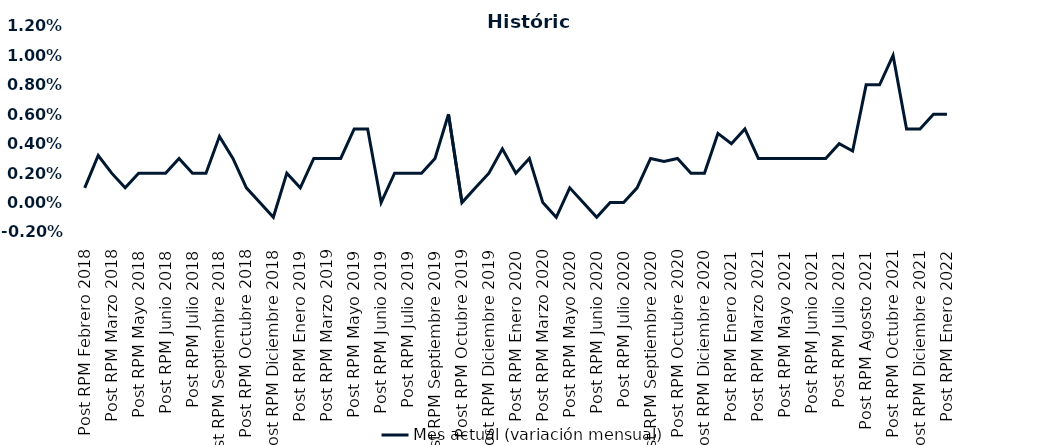
| Category | Mes actual (variación mensual)  |
|---|---|
| Post RPM Febrero 2018 | 0.001 |
| Pre RPM Marzo 2018 | 0.003 |
| Post RPM Marzo 2018 | 0.002 |
| Pre RPM Mayo 2018 | 0.001 |
| Post RPM Mayo 2018 | 0.002 |
| Pre RPM Junio 2018 | 0.002 |
| Post RPM Junio 2018 | 0.002 |
| Pre RPM Julio 2018 | 0.003 |
| Post RPM Julio 2018 | 0.002 |
| Pre RPM Septiembre 2018 | 0.002 |
| Post RPM Septiembre 2018 | 0.004 |
| Pre RPM Octubre 2018 | 0.003 |
| Post RPM Octubre 2018 | 0.001 |
| Pre RPM Diciembre 2018 | 0 |
| Post RPM Diciembre 2018 | -0.001 |
| Pre RPM Enero 2019 | 0.002 |
| Post RPM Enero 2019 | 0.001 |
| Pre RPM Marzo 2019 | 0.003 |
| Post RPM Marzo 2019 | 0.003 |
| Pre RPM Mayo 2019 | 0.003 |
| Post RPM Mayo 2019 | 0.005 |
| Pre RPM Junio 2019 | 0.005 |
| Post RPM Junio 2019 | 0 |
| Pre RPM Julio 2019 | 0.002 |
| Post RPM Julio 2019 | 0.002 |
| Pre RPM Septiembre 2019 | 0.002 |
| Post RPM Septiembre 2019 | 0.003 |
| Pre RPM Octubre 2019 | 0.006 |
| Post RPM Octubre 2019 | 0 |
| Pre RPM Diciembre 2019 | 0.001 |
| Post RPM Diciembre 2019 | 0.002 |
| Pre RPM Enero 2020 | 0.004 |
| Post RPM Enero 2020 | 0.002 |
| Pre RPM Marzo 2020 | 0.003 |
| Post RPM Marzo 2020 | 0 |
| Pre RPM Mayo 2020 | -0.001 |
| Post RPM Mayo 2020 | 0.001 |
| Pre RPM Junio 2020 | 0 |
| Post RPM Junio 2020 | -0.001 |
| Pre RPM Julio 2020 | 0 |
| Post RPM Julio 2020 | 0 |
| Pre RPM Septiembre 2020 | 0.001 |
| Post RPM Septiembre 2020 | 0.003 |
| Pre RPM Octubre 2020 | 0.003 |
| Post RPM Octubre 2020 | 0.003 |
| Pre RPM Diciembre 2020 | 0.002 |
| Post RPM Diciembre 2020 | 0.002 |
| Pre RPM Enero 2021 | 0.005 |
| Post RPM Enero 2021 | 0.004 |
| Pre RPM Marzo 2021 | 0.005 |
| Post RPM Marzo 2021 | 0.003 |
| Pre RPM Mayo 2021 | 0.003 |
| Post RPM Mayo 2021 | 0.003 |
| Pre RPM Junio 2021 | 0.003 |
| Post RPM Junio 2021 | 0.003 |
| Pre RPM Julio 2021 | 0.003 |
| Post RPM Julio 2021 | 0.004 |
| Pre RPM Agosto 2021 | 0.004 |
| Post RPM Agosto 2021 | 0.008 |
| Pre RPM Octubre 2021 | 0.008 |
| Post RPM Octubre 2021 | 0.01 |
| Pre RPM Diciembre 2021 | 0.005 |
| Post RPM Diciembre 2021 | 0.005 |
| Pre RPM Enero 2022 | 0.006 |
| Post RPM Enero 2022 | 0.006 |